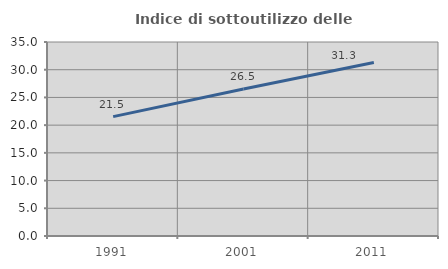
| Category | Indice di sottoutilizzo delle abitazioni  |
|---|---|
| 1991.0 | 21.535 |
| 2001.0 | 26.534 |
| 2011.0 | 31.309 |